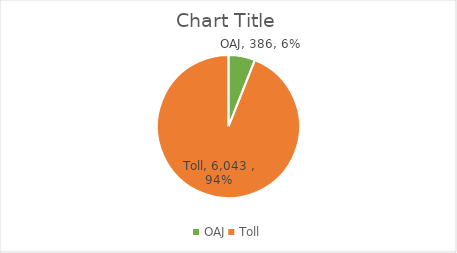
| Category | Series 0 |
|---|---|
| OAJ | 386 |
| Toll | 6043 |